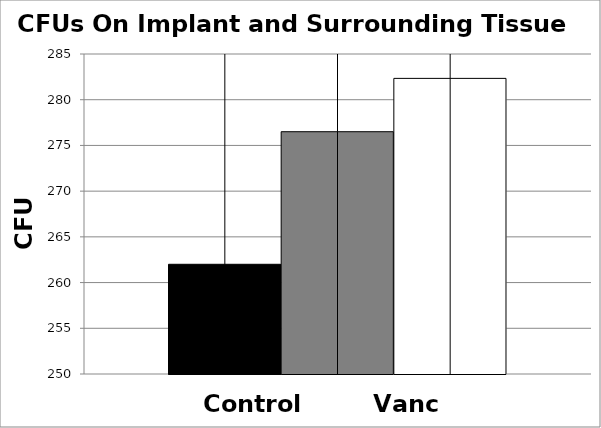
| Category | Control | Vanc | Combined |
|---|---|---|---|
| 0 | 262 | 276.5 | 282.333 |